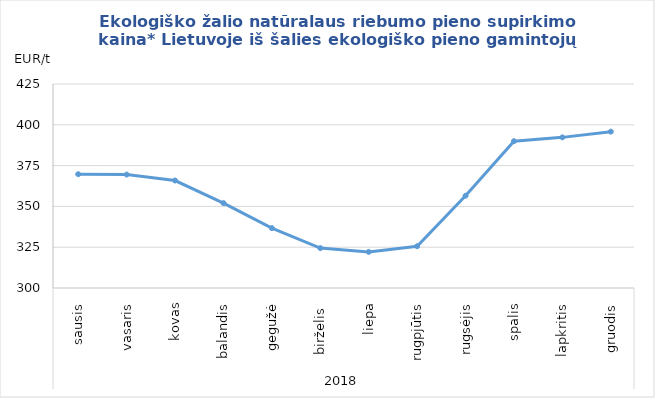
| Category | Ekologiško žalio natūralaus riebumo pieno supirkimo kaina* Lietuvoje iš šalies ekologiško pieno gamintojų |
|---|---|
| 0 | 369.72 |
| 1 | 369.51 |
| 2 | 365.86 |
| 3 | 352.01 |
| 4 | 336.7 |
| 5 | 324.44 |
| 6 | 322.13 |
| 7 | 325.59 |
| 8 | 356.54 |
| 9 | 389.97 |
| 10 | 392.3 |
| 11 | 395.81 |